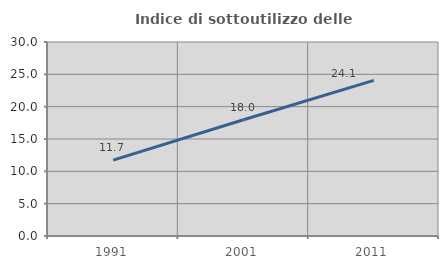
| Category | Indice di sottoutilizzo delle abitazioni  |
|---|---|
| 1991.0 | 11.724 |
| 2001.0 | 17.977 |
| 2011.0 | 24.057 |